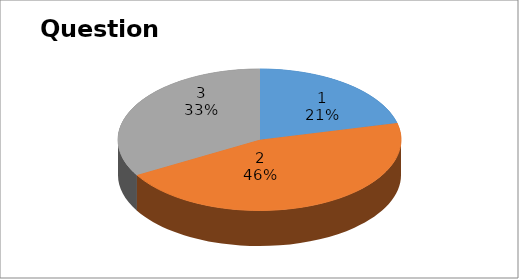
| Category | Series 0 |
|---|---|
| 0 | 7 |
| 1 | 15 |
| 2 | 11 |